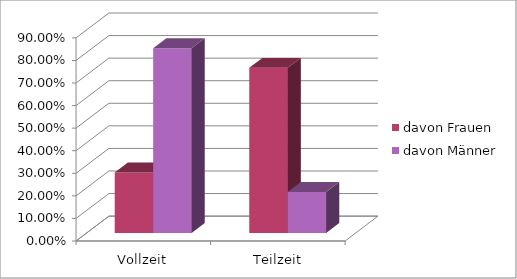
| Category | davon Frauen | davon Männer |
|---|---|---|
| Vollzeit | 0.268 | 0.819 |
| Teilzeit | 0.732 | 0.181 |